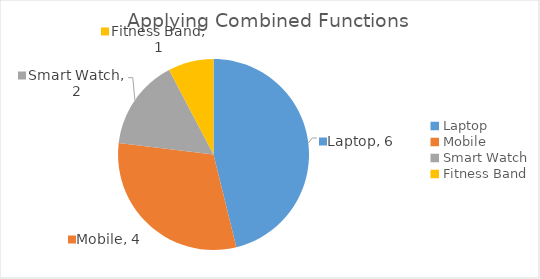
| Category | Series 0 |
|---|---|
| Laptop | 6 |
| Mobile | 4 |
| Smart Watch | 2 |
| Fitness Band | 1 |